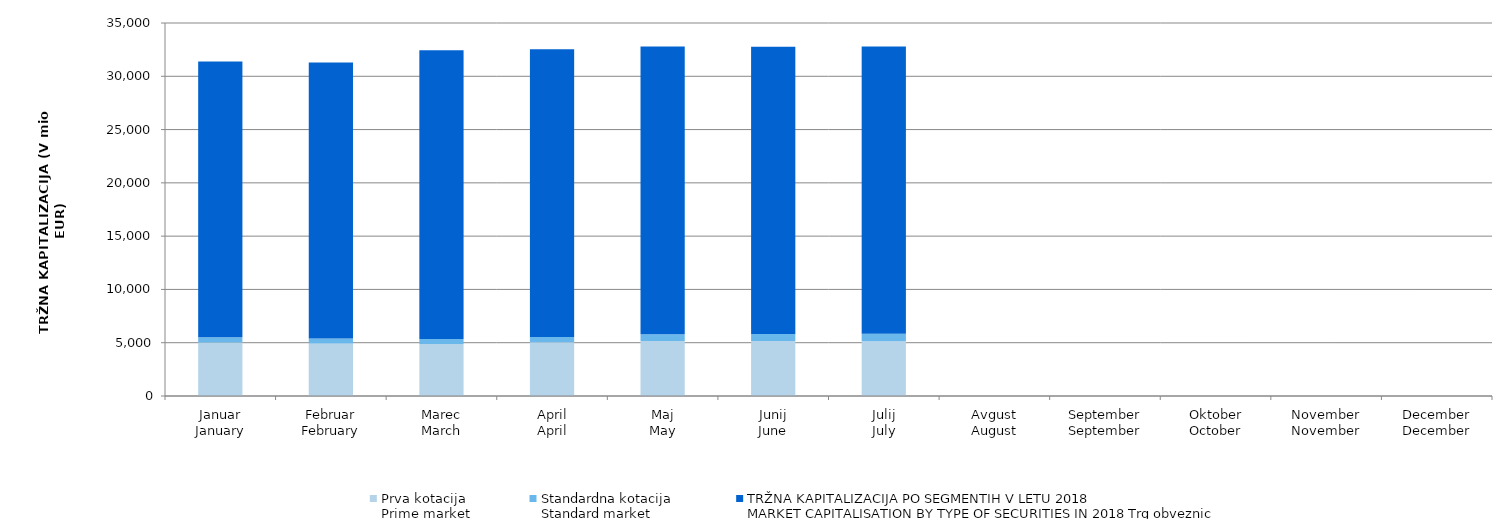
| Category | Prva kotacija
Prime market | Standardna kotacija
Standard market | Series 3 |
|---|---|---|---|
| Januar
January | 5022.792 | 483.67 | 25885.901 |
| Februar
February | 4922.405 | 471.165 | 25899.375 |
| Marec
March | 4884.025 | 463.212 | 27099.633 |
| April
April | 5038.448 | 492.653 | 27015.924 |
| Maj
May | 5153.368 | 630.304 | 27015.655 |
| Junij
June | 5151.963 | 663.065 | 26962.481 |
| Julij
July | 5126.931 | 703.136 | 26961.579 |
| Avgust
August | 0 | 0 | 0 |
| September
September | 0 | 0 | 0 |
| Oktober
October | 0 | 0 | 0 |
| November
November | 0 | 0 | 0 |
| December
December | 0 | 0 | 0 |